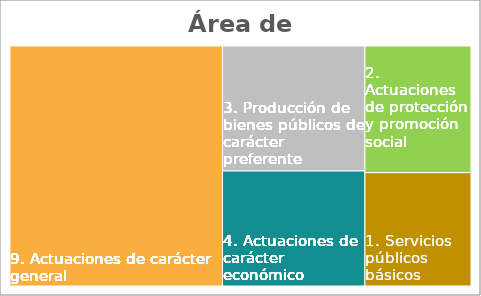
| Category | Series 0 |
|---|---|
| 60. Inv. nueva en infraestruc. y bienes para uso general. | 0.054 |
| 61. Inv. de reposición infraest. y bienes uso gral. | 0.397 |
| 62. Inv.nueva asociada al funcionam. operativo serv. | 0.073 |
| 63. Inv. reposición assoc. funcionamiento operativo serv. | 0.319 |
| 64. Gastos en inversiones de carácter immaterial | 0.078 |
| 65. Gastos inv. gestionadas por otros entes púbicos | 0.077 |
| 68. Gastos en inversiones de bienes patrimoniales  | 0.003 |